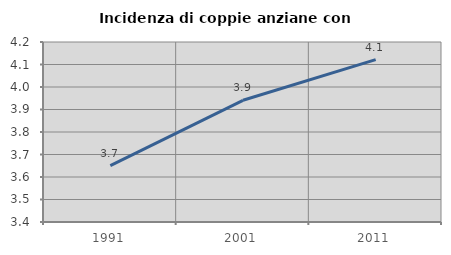
| Category | Incidenza di coppie anziane con figli |
|---|---|
| 1991.0 | 3.651 |
| 2001.0 | 3.941 |
| 2011.0 | 4.122 |